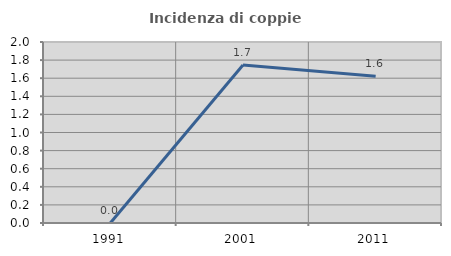
| Category | Incidenza di coppie miste |
|---|---|
| 1991.0 | 0 |
| 2001.0 | 1.746 |
| 2011.0 | 1.622 |